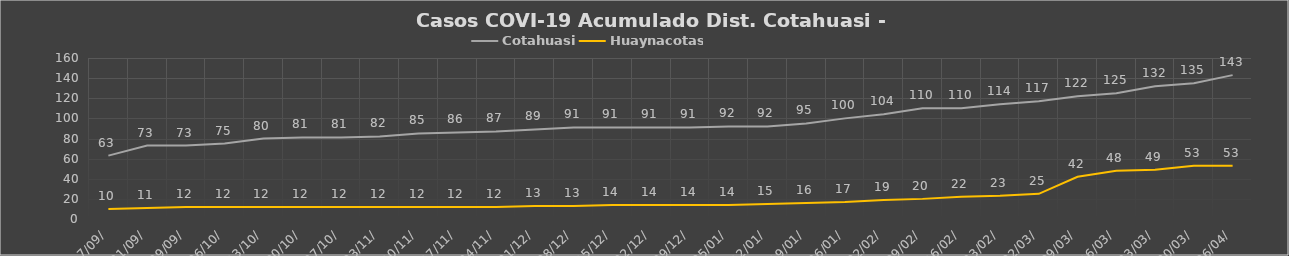
| Category | Cotahuasi | Huaynacotas |
|---|---|---|
| 7/09/ | 63 | 10 |
| 21/09/ | 73 | 11 |
| 29/09/ | 73 | 12 |
| 06/10/ | 75 | 12 |
| 13/10/ | 80 | 12 |
| 20/10/ | 81 | 12 |
| 27/10/ | 81 | 12 |
| 03/11/ | 82 | 12 |
| 10/11/ | 85 | 12 |
| 17/11/ | 86 | 12 |
| 24/11/ | 87 | 12 |
| 01/12/ | 89 | 13 |
| 08/12/ | 91 | 13 |
| 15/12/ | 91 | 14 |
| 22/12/ | 91 | 14 |
| 29/12/ | 91 | 14 |
| 05/01/ | 92 | 14 |
| 12/01/ | 92 | 15 |
| 19/01/ | 95 | 16 |
| 26/01/ | 100 | 17 |
| 02/02/ | 104 | 19 |
| 09/02/ | 110 | 20 |
| 16/02/ | 110 | 22 |
| 23/02/ | 114 | 23 |
| 02/03/ | 117 | 25 |
| 09/03/ | 122 | 42 |
| 16/03/ | 125 | 48 |
| 23/03/ | 132 | 49 |
| 30/03/ | 135 | 53 |
| 06/04/ | 143 | 53 |